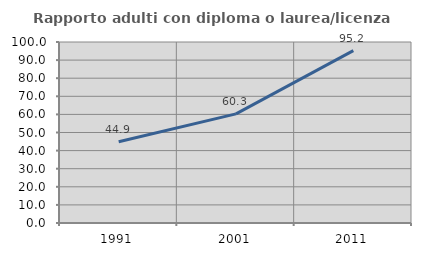
| Category | Rapporto adulti con diploma o laurea/licenza media  |
|---|---|
| 1991.0 | 44.928 |
| 2001.0 | 60.303 |
| 2011.0 | 95.23 |